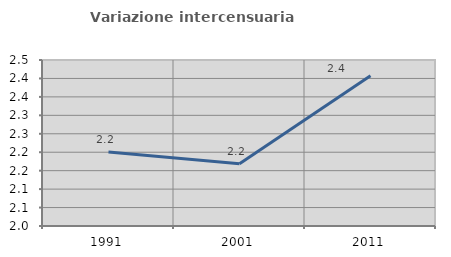
| Category | Variazione intercensuaria annua |
|---|---|
| 1991.0 | 2.201 |
| 2001.0 | 2.169 |
| 2011.0 | 2.407 |